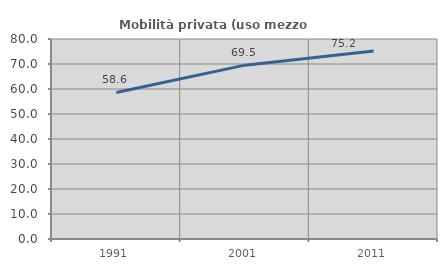
| Category | Mobilità privata (uso mezzo privato) |
|---|---|
| 1991.0 | 58.605 |
| 2001.0 | 69.54 |
| 2011.0 | 75.219 |